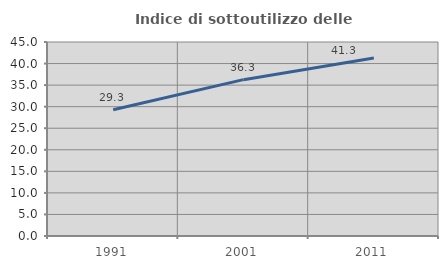
| Category | Indice di sottoutilizzo delle abitazioni  |
|---|---|
| 1991.0 | 29.269 |
| 2001.0 | 36.267 |
| 2011.0 | 41.294 |